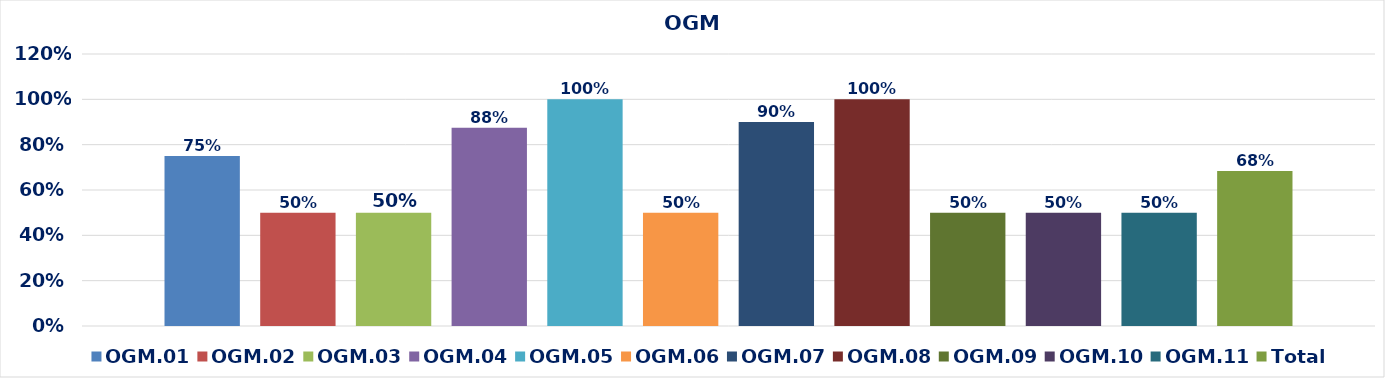
| Category | OGM.01 | OGM.02 | OGM.03 | OGM.04 | OGM.05 | OGM.06 | OGM.07 | OGM.08 | OGM.09 | OGM.10 | OGM.11 | Total |
|---|---|---|---|---|---|---|---|---|---|---|---|---|
| 0 | 0.75 | 0.5 | 0.5 | 0.875 | 1 | 0.5 | 0.9 | 1 | 0.5 | 0.5 | 0.5 | 0.684 |